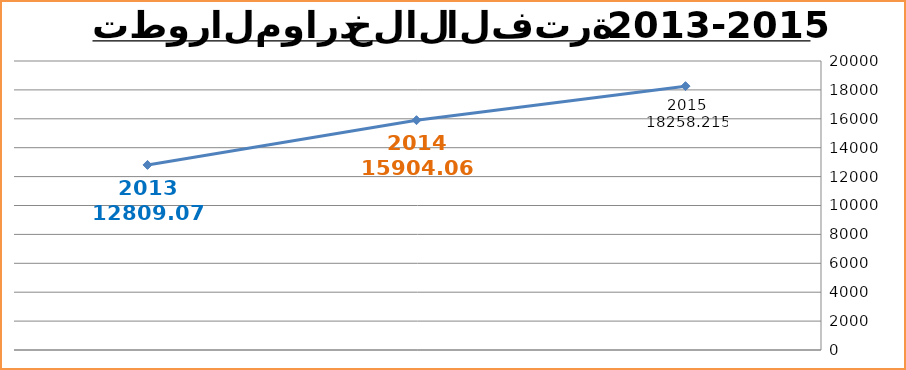
| Category | Series 0 |
|---|---|
| 0 | 18258.215 |
| 1 | 15904.067 |
| 2 | 12809.075 |